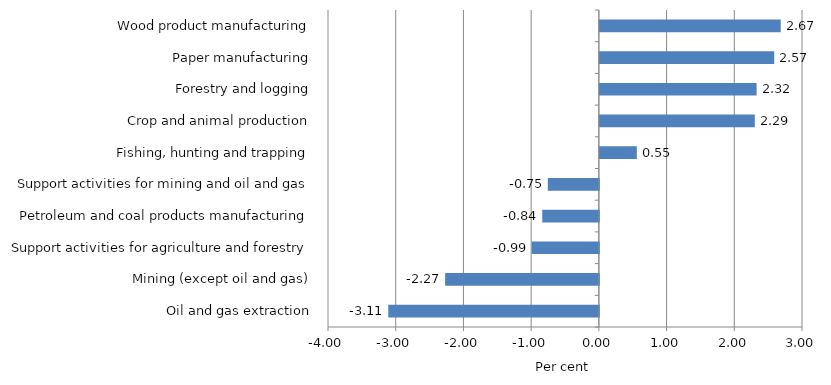
| Category | Series 0 |
|---|---|
| Oil and gas extraction | -3.11 |
| Mining (except oil and gas) | -2.27 |
| Support activities for agriculture and forestry | -0.992 |
| Petroleum and coal products manufacturing | -0.836 |
| Support activities for mining and oil and gas | -0.754 |
| Fishing, hunting and trapping | 0.546 |
| Crop and animal production | 2.288 |
| Forestry and logging | 2.315 |
| Paper manufacturing | 2.575 |
| Wood product manufacturing | 2.671 |